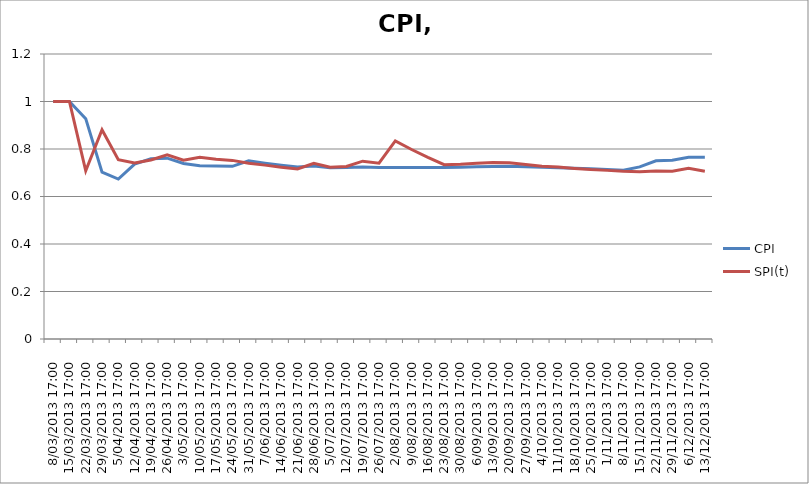
| Category | CPI | SPI(t) |
|---|---|---|
| 8/03/2013 17:00 | 1 | 1 |
| 15/03/2013 17:00 | 1 | 1 |
| 22/03/2013 17:00 | 0.928 | 0.708 |
| 29/03/2013 17:00 | 0.702 | 0.881 |
| 5/04/2013 17:00 | 0.673 | 0.755 |
| 12/04/2013 17:00 | 0.737 | 0.742 |
| 19/04/2013 17:00 | 0.759 | 0.754 |
| 26/04/2013 17:00 | 0.761 | 0.775 |
| 3/05/2013 17:00 | 0.739 | 0.753 |
| 10/05/2013 17:00 | 0.73 | 0.765 |
| 17/05/2013 17:00 | 0.728 | 0.757 |
| 24/05/2013 17:00 | 0.727 | 0.752 |
| 31/05/2013 17:00 | 0.75 | 0.74 |
| 7/06/2013 17:00 | 0.74 | 0.732 |
| 14/06/2013 17:00 | 0.732 | 0.723 |
| 21/06/2013 17:00 | 0.724 | 0.716 |
| 28/06/2013 17:00 | 0.729 | 0.74 |
| 5/07/2013 17:00 | 0.721 | 0.724 |
| 12/07/2013 17:00 | 0.722 | 0.726 |
| 19/07/2013 17:00 | 0.724 | 0.749 |
| 26/07/2013 17:00 | 0.722 | 0.74 |
| 2/08/2013 17:00 | 0.722 | 0.834 |
| 9/08/2013 17:00 | 0.722 | 0.798 |
| 16/08/2013 17:00 | 0.722 | 0.765 |
| 23/08/2013 17:00 | 0.722 | 0.734 |
| 30/08/2013 17:00 | 0.723 | 0.736 |
| 6/09/2013 17:00 | 0.725 | 0.74 |
| 13/09/2013 17:00 | 0.726 | 0.743 |
| 20/09/2013 17:00 | 0.728 | 0.742 |
| 27/09/2013 17:00 | 0.725 | 0.735 |
| 4/10/2013 17:00 | 0.723 | 0.727 |
| 11/10/2013 17:00 | 0.721 | 0.724 |
| 18/10/2013 17:00 | 0.719 | 0.718 |
| 25/10/2013 17:00 | 0.716 | 0.713 |
| 1/11/2013 17:00 | 0.714 | 0.71 |
| 8/11/2013 17:00 | 0.711 | 0.706 |
| 15/11/2013 17:00 | 0.725 | 0.705 |
| 22/11/2013 17:00 | 0.75 | 0.707 |
| 29/11/2013 17:00 | 0.752 | 0.706 |
| 6/12/2013 17:00 | 0.765 | 0.719 |
| 13/12/2013 17:00 | 0.765 | 0.706 |